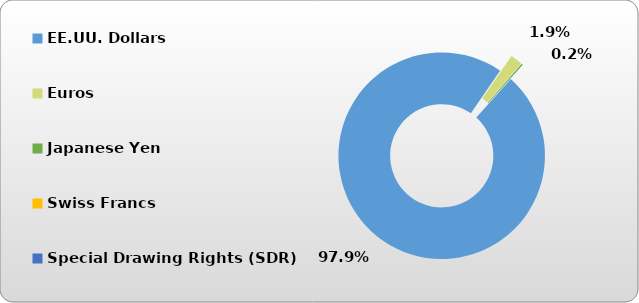
| Category | EE.UU. Dollars |
|---|---|
| EE.UU. Dollars | 45458.816 |
| Euros | 871.508 |
| Japanese Yen | 106.947 |
| Swiss Francs | 0 |
| Special Drawing Rights (SDR) | 2.77 |